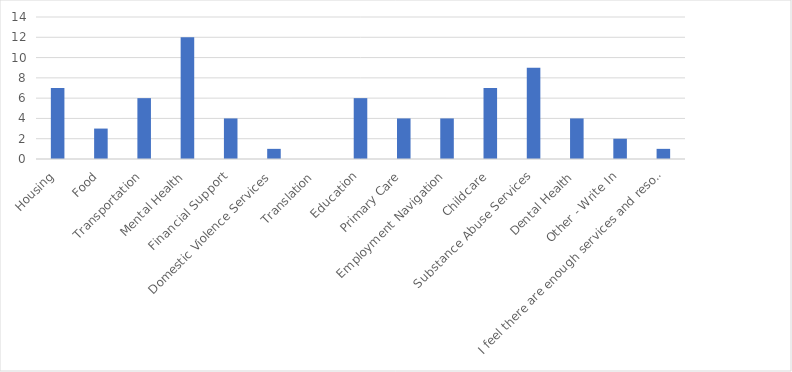
| Category | Number of Responses |
|---|---|
| Housing | 7 |
| Food | 3 |
| Transportation | 6 |
| Mental Health | 12 |
| Financial Support | 4 |
| Domestic Violence Services | 1 |
| Translation | 0 |
| Education | 6 |
| Primary Care | 4 |
| Employment Navigation | 4 |
| Childcare | 7 |
| Substance Abuse Services | 9 |
| Dental Health | 4 |
| Other - Write In | 2 |
| I feel there are enough services and resources to refer my patients/clients to. | 1 |